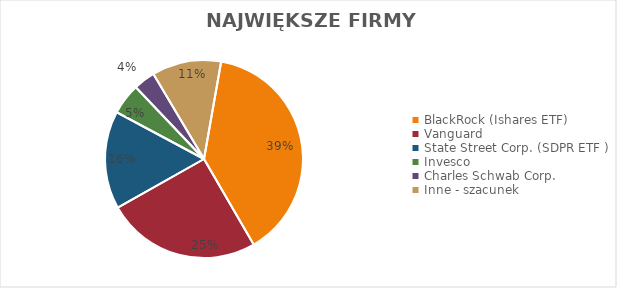
| Category | Series 0 |
|---|---|
| BlackRock (Ishares ETF) | 1554 |
| Vanguard | 1008 |
| State Street Corp. (SDPR ETF ) | 640 |
| Invesco | 203 |
| Charles Schwab Corp. | 142 |
| Inne - szacunek | 453 |